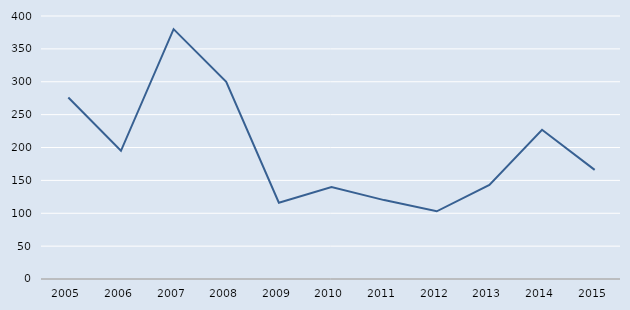
| Category | Series 0 |
|---|---|
| 2005.0 | 276 |
| 2006.0 | 195 |
| 2007.0 | 380 |
| 2008.0 | 300 |
| 2009.0 | 116 |
| 2010.0 | 140 |
| 2011.0 | 120 |
| 2012.0 | 103 |
| 2013.0 | 143 |
| 2014.0 | 227 |
| 2015.0 | 166 |